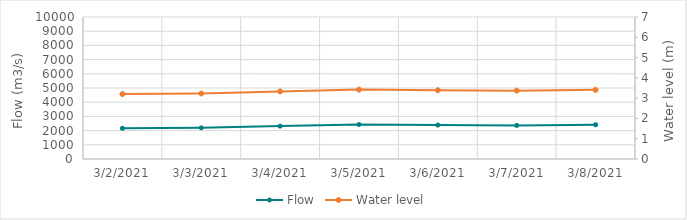
| Category | Flow |
|---|---|
| 2/18/21 | 2540.09 |
| 2/17/21 | 2719.77 |
| 2/16/21 | 2906.47 |
| 2/15/21 | 3089.79 |
| 2/14/21 | 3063.69 |
| 2/13/21 | 3227.1 |
| 2/12/21 | 3370.38 |